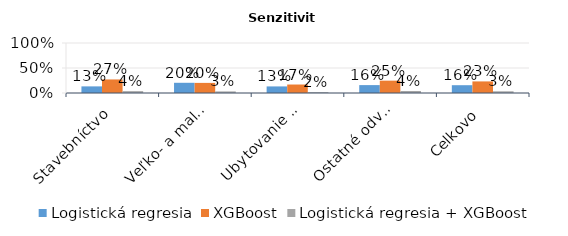
| Category | Logistická regresia | XGBoost | Logistická regresia + XGBoost |
|---|---|---|---|
| Stavebníctvo | 0.132 | 0.271 | 0.037 |
| Veľko- a maloobchod | 0.204 | 0.202 | 0.032 |
| Ubytovanie a stravovanie | 0.132 | 0.169 | 0.017 |
| Ostatné odvetvia | 0.158 | 0.247 | 0.04 |
| Celkovo | 0.156 | 0.232 | 0.034 |